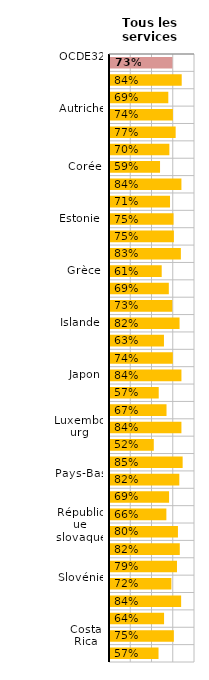
| Category | Total |
|---|---|
| OCDE32 | 0.734 |
| Allemagne | 0.844 |
| Australie | 0.686 |
| Autriche | 0.74 |
| Belgique | 0.772 |
| Canada | 0.698 |
| Corée | 0.589 |
| Danemark | 0.84 |
| Espagne | 0.706 |
| Estonie | 0.747 |
| Finlande | 0.752 |
| France | 0.834 |
| Grèce | 0.608 |
| Hongrie | 0.692 |
| Irlande | 0.733 |
| Islande | 0.818 |
| Israël | 0.635 |
| Italie | 0.739 |
| Japon | 0.84 |
| Lettonie | 0.573 |
| Lituanie | 0.665 |
| Luxembourg | 0.84 |
| Mexique | 0.515 |
| Norvège | 0.855 |
| Pays-Bas | 0.815 |
| Pologne | 0.695 |
| Portugal | 0.663 |
| République slovaque | 0.799 |
| République tchèque | 0.821 |
| Royaume-Uni | 0.788 |
| Slovénie | 0.722 |
| Suède | 0.837 |
| Suisse | 0.636 |
| Costa Rica | 0.751 |
| Fédération de Russie | 0.571 |